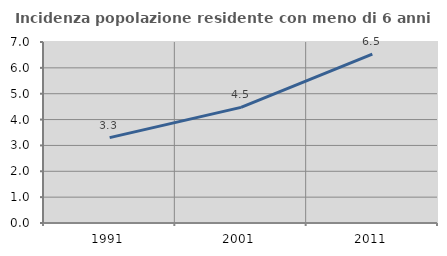
| Category | Incidenza popolazione residente con meno di 6 anni |
|---|---|
| 1991.0 | 3.301 |
| 2001.0 | 4.473 |
| 2011.0 | 6.527 |